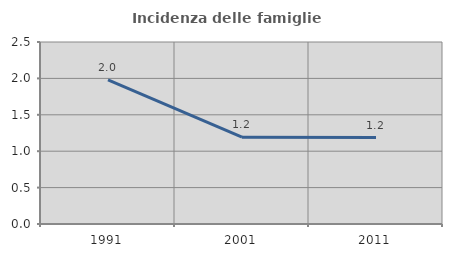
| Category | Incidenza delle famiglie numerose |
|---|---|
| 1991.0 | 1.979 |
| 2001.0 | 1.193 |
| 2011.0 | 1.188 |